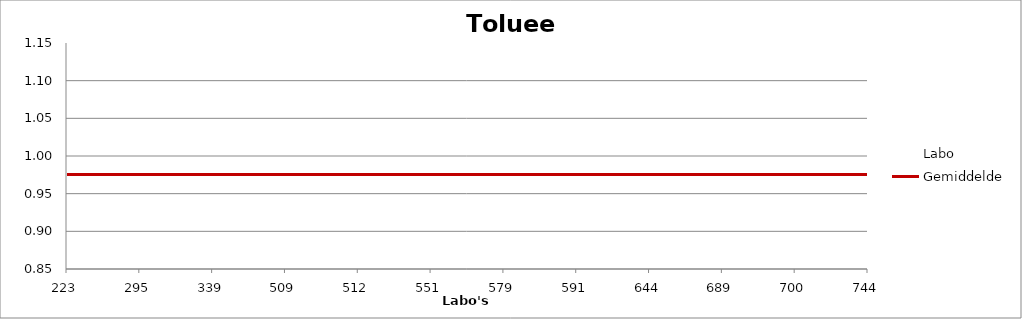
| Category | Labo | Gemiddelde |
|---|---|---|
| 223.0 | 1.049 | 0.975 |
| 295.0 | 0.993 | 0.975 |
| 339.0 | 0.952 | 0.975 |
| 509.0 | 0.894 | 0.975 |
| 512.0 | 0.957 | 0.975 |
| 551.0 | 1.005 | 0.975 |
| 579.0 | 0.961 | 0.975 |
| 591.0 | 1.015 | 0.975 |
| 644.0 | 1 | 0.975 |
| 689.0 | 0.954 | 0.975 |
| 700.0 | 1.014 | 0.975 |
| 744.0 | 0.906 | 0.975 |